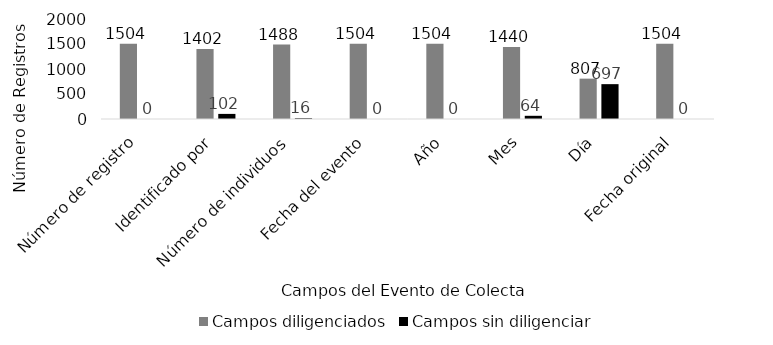
| Category | Campos diligenciados | Campos sin diligenciar |
|---|---|---|
| Número de registro | 1504 | 0 |
| Identificado por | 1402 | 102 |
| Número de individuos | 1488 | 16 |
| Fecha del evento | 1504 | 0 |
| Año | 1504 | 0 |
| Mes | 1440 | 64 |
| Día | 807 | 697 |
| Fecha original | 1504 | 0 |